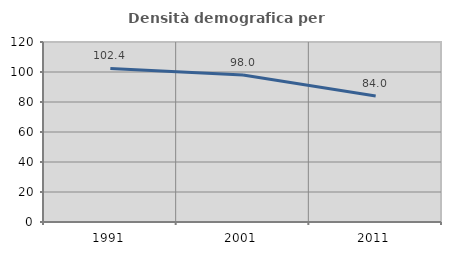
| Category | Densità demografica |
|---|---|
| 1991.0 | 102.362 |
| 2001.0 | 98.042 |
| 2011.0 | 84.025 |